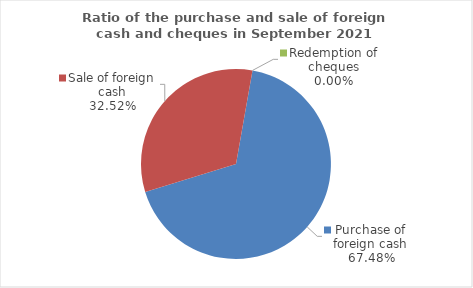
| Category | Series 0 |
|---|---|
| Purchase of foreign cash | 67.475 |
| Sale of foreign cash | 32.525 |
| Redemption of cheques | 0 |